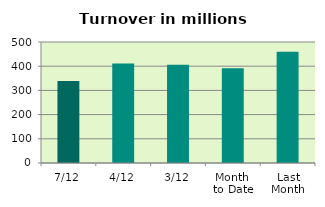
| Category | Series 0 |
|---|---|
| 7/12 | 338.992 |
| 4/12 | 411.241 |
| 3/12 | 406.118 |
| Month 
to Date | 391.264 |
| Last
Month | 459.961 |